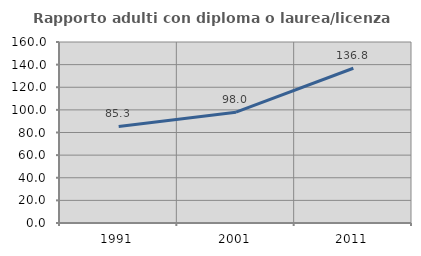
| Category | Rapporto adulti con diploma o laurea/licenza media  |
|---|---|
| 1991.0 | 85.342 |
| 2001.0 | 97.973 |
| 2011.0 | 136.773 |